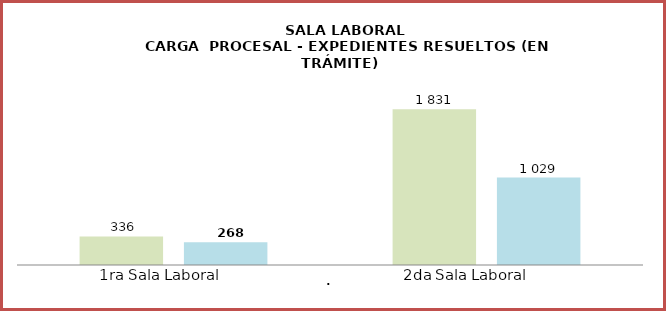
| Category | Series 0 | Series 1 | Series 2 | Series 3 | Series 4 | carga procesal |
|---|---|---|---|---|---|---|
| 0 | 336 | 268 | 0 | 1831 | 1029 |  |